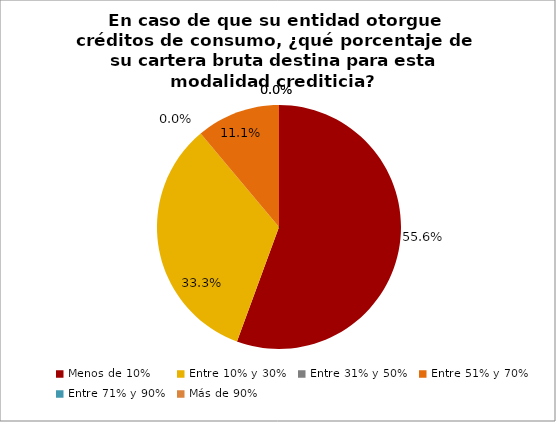
| Category | Series 0 |
|---|---|
| Menos de 10% | 0.556 |
| Entre 10% y 30% | 0.333 |
| Entre 31% y 50% | 0 |
| Entre 51% y 70% | 0.111 |
| Entre 71% y 90% | 0 |
| Más de 90% | 0 |